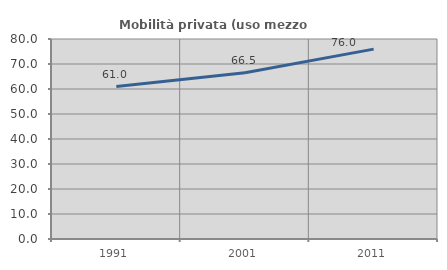
| Category | Mobilità privata (uso mezzo privato) |
|---|---|
| 1991.0 | 60.954 |
| 2001.0 | 66.473 |
| 2011.0 | 75.957 |